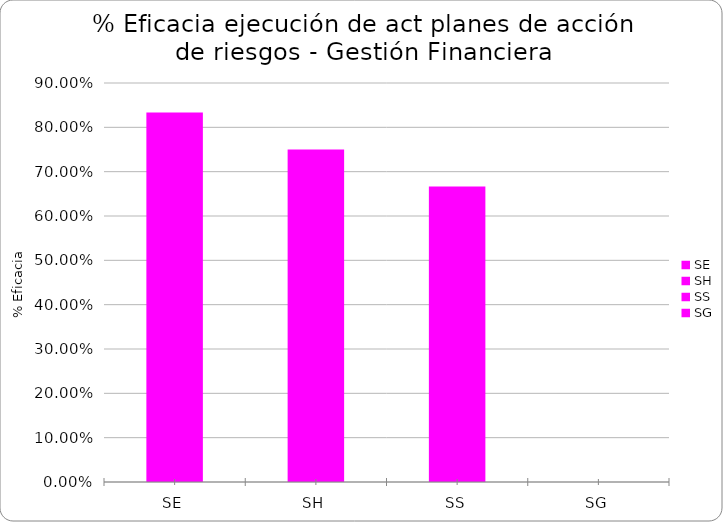
| Category | % Eficacia total |
|---|---|
| SE | 0.833 |
| SH | 0.75 |
| SS | 0.667 |
| SG | 0 |